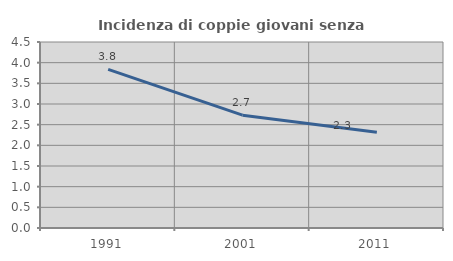
| Category | Incidenza di coppie giovani senza figli |
|---|---|
| 1991.0 | 3.839 |
| 2001.0 | 2.729 |
| 2011.0 | 2.316 |